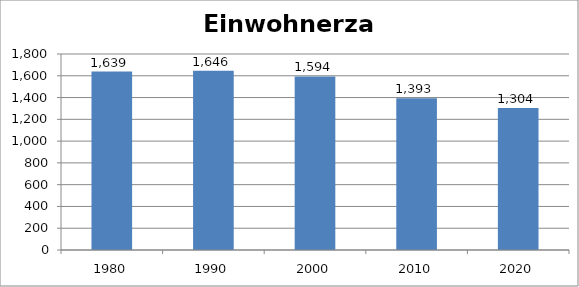
| Category | Einwohnerzahl |
|---|---|
| 1980.0 | 1639 |
| 1990.0 | 1646 |
| 2000.0 | 1594 |
| 2010.0 | 1393 |
| 2020.0 | 1304 |